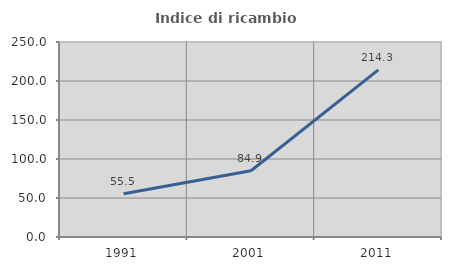
| Category | Indice di ricambio occupazionale  |
|---|---|
| 1991.0 | 55.501 |
| 2001.0 | 84.918 |
| 2011.0 | 214.286 |